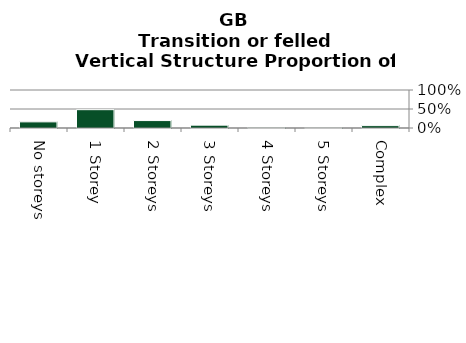
| Category | Transition or felled |
|---|---|
| No storeys | 0.161 |
| 1 Storey | 0.482 |
| 2 Storeys | 0.196 |
| 3 Storeys | 0.075 |
| 4 Storeys | 0.018 |
| 5 Storeys | 0.005 |
| Complex | 0.063 |